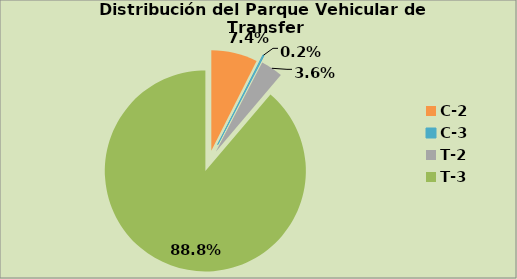
| Category | Series 0 |
|---|---|
| C-2 | 7.444 |
| C-3  | 0.195 |
| T-2 | 3.568 |
| T-3 | 88.792 |